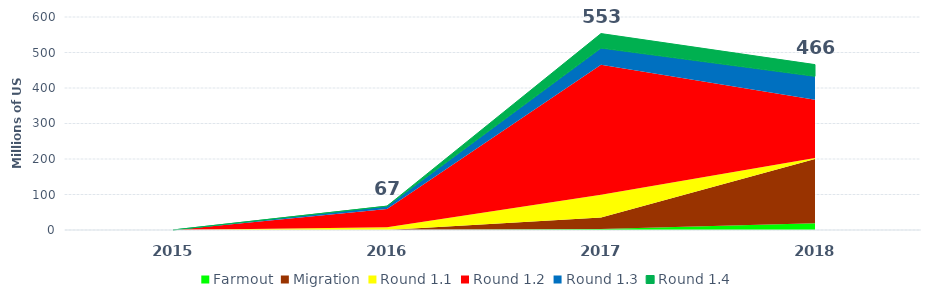
| Category | Series 6 |
|---|---|
| 2015.0 | 0.026 |
| 2016.0 | 67.155 |
| 2017.0 | 553.267 |
| 2018.0 | 465.874 |